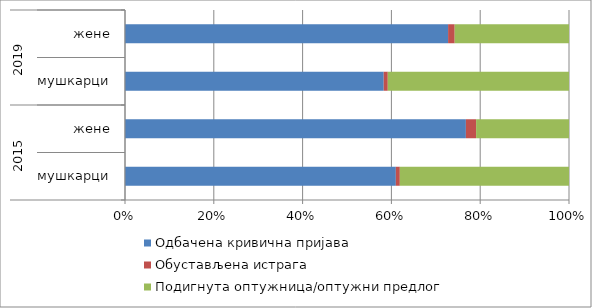
| Category | Одбачена кривична пријава | Обустављена истрага | Подигнута оптужница/оптужни предлог |
|---|---|---|---|
| 0 | 60.96 | 0.899 | 38.075 |
| 1 | 76.778 | 2.301 | 20.921 |
| 2 | 58.269 | 0.917 | 40.814 |
| 3 | 72.769 | 1.487 | 25.744 |